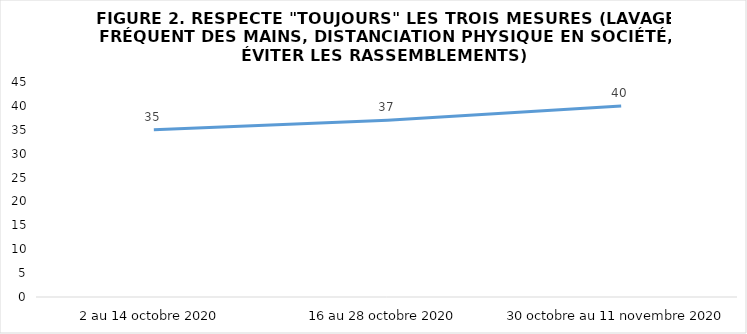
| Category | Series 0 |
|---|---|
| 2 au 14 octobre 2020 | 35 |
| 16 au 28 octobre 2020 | 37 |
| 30 octobre au 11 novembre 2020 | 40 |